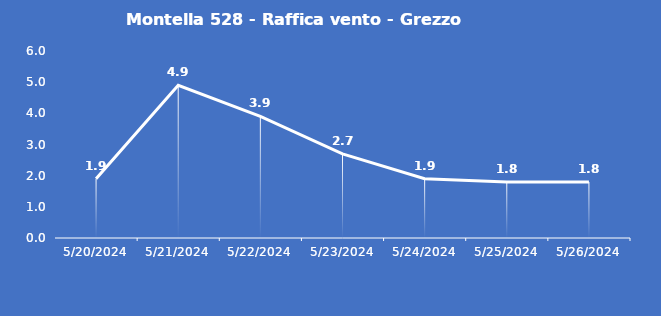
| Category | Montella 528 - Raffica vento - Grezzo (m/s) |
|---|---|
| 5/20/24 | 1.9 |
| 5/21/24 | 4.9 |
| 5/22/24 | 3.9 |
| 5/23/24 | 2.7 |
| 5/24/24 | 1.9 |
| 5/25/24 | 1.8 |
| 5/26/24 | 1.8 |